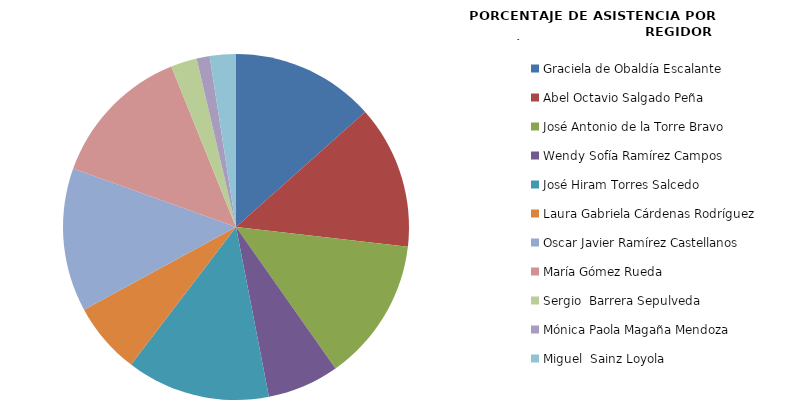
| Category | Series 0 |
|---|---|
| Graciela de Obaldía Escalante | 100 |
| Abel Octavio Salgado Peña | 100 |
| José Antonio de la Torre Bravo | 100 |
| Wendy Sofía Ramírez Campos | 50 |
| José Hiram Torres Salcedo | 100 |
| Laura Gabriela Cárdenas Rodríguez | 50 |
| Oscar Javier Ramírez Castellanos | 100 |
| María Gómez Rueda | 100 |
| Sergio  Barrera Sepulveda | 18.182 |
| Mónica Paola Magaña Mendoza | 9.091 |
| Miguel  Sainz Loyola | 18.182 |